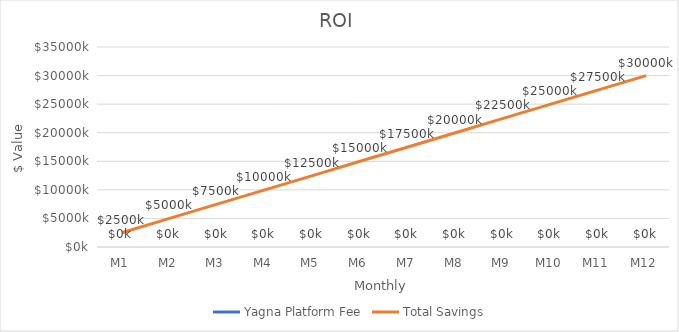
| Category | Yagna Platform Fee | Total Savings |
|---|---|---|
| M1 | 0 | 2500000 |
| M2 | 0 | 5000000 |
| M3 | 0 | 7500000 |
| M4 | 0 | 10000000 |
| M5 | 0 | 12500000 |
| M6 | 0 | 15000000 |
| M7 | 0 | 17500000 |
| M8 | 0 | 20000000 |
| M9 | 0 | 22500000 |
| M10 | 0 | 25000000 |
| M11 | 0 | 27500000 |
| M12 | 0 | 30000000 |